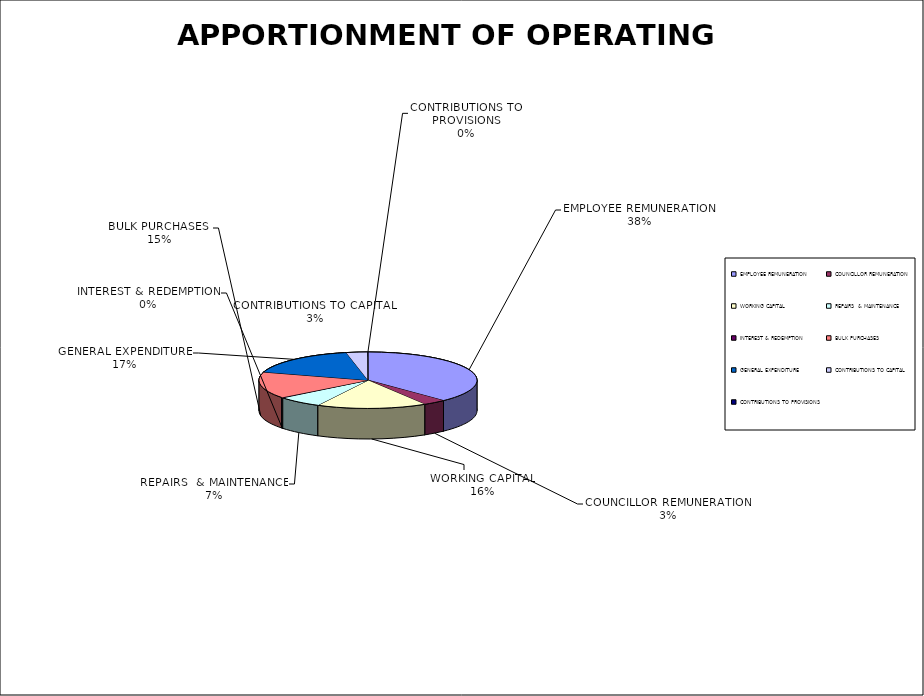
| Category | Series 0 |
|---|---|
| EMPLOYEE REMUNERATION | 68506310 |
| COUNCILLOR REMUNERATION | 6285000 |
| WORKING CAPITAL | 29532802.651 |
| REPAIRS  & MAINTENANCE | 12110233.634 |
| INTEREST & REDEMPTION | 424200 |
| BULK PURCHASES  | 27434750 |
| GENERAL EXPENDITURE | 31008830.623 |
| CONTRIBUTIONS TO CAPITAL  | 5774735 |
| CONTRIBUTIONS TO PROVISIONS | 38697.4 |